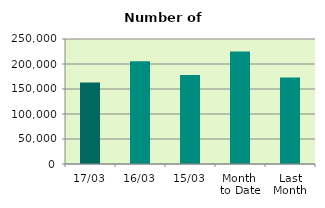
| Category | Series 0 |
|---|---|
| 17/03 | 162778 |
| 16/03 | 205650 |
| 15/03 | 177912 |
| Month 
to Date | 225135.538 |
| Last
Month | 173197.3 |